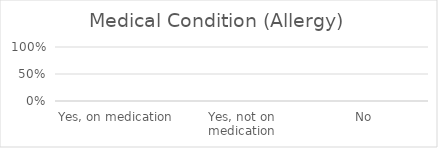
| Category | Allergy |
|---|---|
| Yes, on medication | 0 |
| Yes, not on medication | 0 |
| No | 0 |